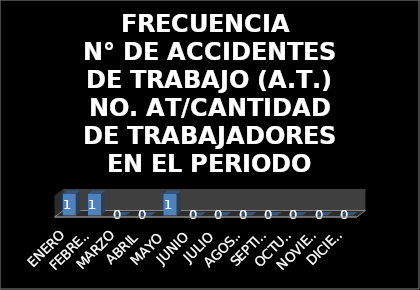
| Category | FRECUENCIA 
N° DE ACCIDENTES DE TRABAJO (A.T.)
NO. AT/CANTIDAD DE TRABAJADORES EN EL PERIODO |
|---|---|
| ENERO | 1 |
| FEBRERO | 1 |
| MARZO | 0 |
| ABRIL | 0 |
| MAYO | 1 |
| JUNIO | 0 |
| JULIO | 0 |
| AGOSTO | 0 |
| SEPTIEMBRE | 0 |
| OCTUBRE | 0 |
| NOVIEMBRE | 0 |
| DICIEMBRE | 0 |